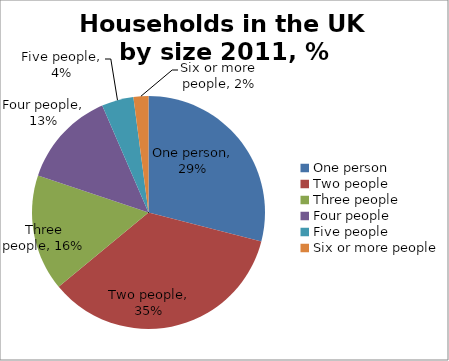
| Category | Series 0 |
|---|---|
| One person | 0.29 |
| Two people | 0.35 |
| Three people | 0.161 |
| Four people | 0.134 |
| Five people | 0.044 |
| Six or more people | 0.021 |